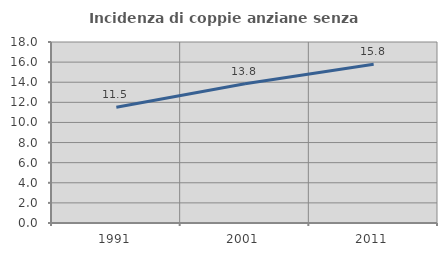
| Category | Incidenza di coppie anziane senza figli  |
|---|---|
| 1991.0 | 11.505 |
| 2001.0 | 13.842 |
| 2011.0 | 15.781 |